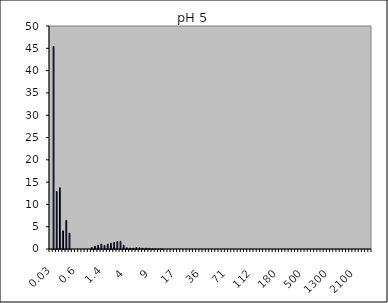
| Category | Magnetite pH 3 1 |
|---|---|
| 0.03 | 0 |
| 0.04 | 45.383 |
| 0.07 | 12.89 |
| 0.1 | 13.73 |
| 0.2 | 4.081 |
| 0.3 | 6.422 |
| 0.4 | 3.561 |
| 0.5 | 0 |
| 0.6 | 0 |
| 0.7 | 0 |
| 0.8 | 0 |
| 0.9 | 0 |
| 1.0 | 0 |
| 1.1 | 0.347 |
| 1.2 | 0.608 |
| 1.3 | 0.867 |
| 1.4 | 1.115 |
| 1.6 | 0.767 |
| 1.8 | 1.094 |
| 2.0 | 1.286 |
| 2.2 | 1.491 |
| 2.4 | 1.671 |
| 2.6 | 1.734 |
| 3.0 | 0.854 |
| 4.0 | 0.287 |
| 5.0 | 0.222 |
| 6.0 | 0.181 |
| 6.5 | 0.33 |
| 7.0 | 0.268 |
| 7.5 | 0.192 |
| 8.0 | 0.205 |
| 8.5 | 0.164 |
| 9.0 | 0.116 |
| 10.0 | 0.063 |
| 11.0 | 0.035 |
| 12.0 | 0.038 |
| 13.0 | 0 |
| 14.0 | 0 |
| 15.0 | 0 |
| 16.0 | 0 |
| 17.0 | 0 |
| 18.0 | 0 |
| 19.0 | 0 |
| 20.0 | 0 |
| 22.0 | 0 |
| 25.0 | 0 |
| 28.0 | 0 |
| 32.0 | 0 |
| 36.0 | 0 |
| 38.0 | 0 |
| 40.0 | 0 |
| 45.0 | 0 |
| 50.0 | 0 |
| 53.0 | 0 |
| 56.0 | 0 |
| 63.0 | 0 |
| 71.0 | 0 |
| 75.0 | 0 |
| 80.0 | 0 |
| 85.0 | 0 |
| 90.0 | 0 |
| 95.0 | 0 |
| 100.0 | 0 |
| 106.0 | 0 |
| 112.0 | 0 |
| 125.0 | 0 |
| 130.0 | 0 |
| 140.0 | 0 |
| 145.0 | 0 |
| 150.0 | 0 |
| 160.0 | 0 |
| 170.0 | 0 |
| 180.0 | 0 |
| 190.0 | 0 |
| 200.0 | 0 |
| 212.0 | 0 |
| 242.0 | 0 |
| 250.0 | 0 |
| 300.0 | 0 |
| 400.0 | 0 |
| 500.0 | 0 |
| 600.0 | 0 |
| 700.0 | 0 |
| 800.0 | 0 |
| 900.0 | 0 |
| 1000.0 | 0 |
| 1100.0 | 0 |
| 1200.0 | 0 |
| 1300.0 | 0 |
| 1400.0 | 0 |
| 1500.0 | 0 |
| 1600.0 | 0 |
| 1700.0 | 0 |
| 1800.0 | 0 |
| 1900.0 | 0 |
| 2000.0 | 0 |
| 2100.0 | 0 |
| 2200.0 | 0 |
| 2300.0 | 0 |
| 2400.0 | 0 |
| 2500.0 | 0 |